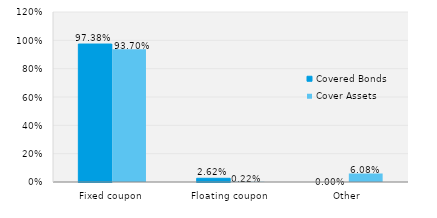
| Category | Covered Bonds | Cover Assets |
|---|---|---|
| Fixed coupon | 0.974 | 0.937 |
| Floating coupon | 0.026 | 0.002 |
| Other | 0 | 0.061 |